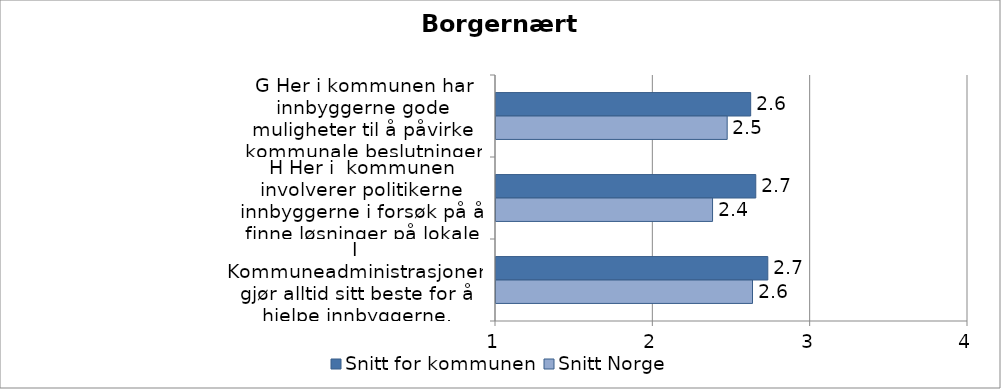
| Category | Snitt for kommunen | Snitt Norge |
|---|---|---|
| G Her i kommunen har innbyggerne gode muligheter til å påvirke kommunale beslutninger som engasjerer dem. | 2.619 | 2.469 |
| H Her i  kommunen involverer politikerne innbyggerne i forsøk på å finne løsninger på lokale problemer | 2.651 | 2.376 |
| I Kommuneadministrasjonen gjør alltid sitt beste for å hjelpe innbyggerne. | 2.728 | 2.63 |